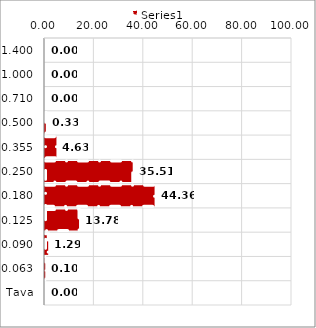
| Category | Series 0 |
|---|---|
| 1,400 | 0 |
| 1,000 | 0 |
| 0,710 | 0 |
| 0,500 | 0.33 |
| 0,355 | 4.63 |
| 0,250 | 35.51 |
| 0,180 | 44.36 |
| 0,125 | 13.78 |
| 0,090 | 1.29 |
| 0,063 | 0.1 |
| Tava | 0 |